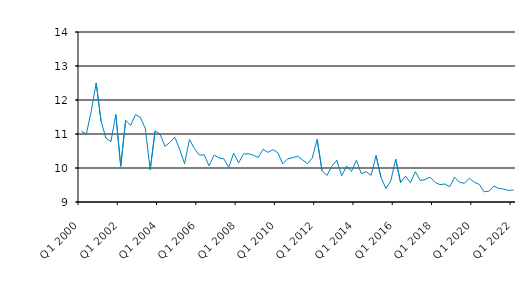
| Category | Series 0 |
|---|---|
| Q1 2000 | 11.08 |
| Q2 2000 | 11 |
| Q3 2000 | 11.679 |
| Q4 2000 | 12.5 |
| Q1 2001 | 11.375 |
| Q2 2001 | 10.875 |
| Q3 2001 | 10.775 |
| Q4 2001 | 11.57 |
| Q1 2002 | 10.05 |
| Q2 2002 | 11.405 |
| Q3 2002 | 11.25 |
| Q4 2002 | 11.566 |
| Q1 2003 | 11.492 |
| Q2 2003 | 11.162 |
| Q3 2003 | 9.95 |
| Q4 2003 | 11.091 |
| Q1 2004 | 11 |
| Q2 2004 | 10.638 |
| Q3 2004 | 10.75 |
| Q4 2004 | 10.908 |
| Q1 2005 | 10.55 |
| Q2 2005 | 10.125 |
| Q3 2005 | 10.843 |
| Q4 2005 | 10.573 |
| Q1 2006 | 10.38 |
| Q2 2006 | 10.387 |
| Q3 2006 | 10.06 |
| Q4 2006 | 10.38 |
| Q1 2007 | 10.3 |
| Q2 2007 | 10.27 |
| Q3 2007 | 10.017 |
| Q4 2007 | 10.44 |
| Q1 2008 | 10.15 |
| Q2 2008 | 10.41 |
| Q3 2008 | 10.42 |
| Q4 2008 | 10.38 |
| Q1 2009 | 10.31 |
| Q2 2009 | 10.55 |
| Q3 2009 | 10.46 |
| Q4 2009 | 10.54 |
| Q1 2010 | 10.45 |
| Q2 2010 | 10.12 |
| Q3 2010 | 10.27 |
| Q4 2010 | 10.3 |
| Q1 2011 | 10.35 |
| Q2 2011 | 10.24 |
| Q3 2011 | 10.125 |
| Q4 2011 | 10.29 |
| Q1 2012 | 10.84 |
| Q2 2012 | 9.92 |
| Q3 2012 | 9.78 |
| Q4 2012 | 10.05 |
| Q1 2013 | 10.23 |
| Q2 2013 | 9.77 |
| Q3 2013 | 10.06 |
| Q4 2013 | 9.9 |
| Q1 2014 | 10.23 |
| Q2 2014 | 9.83 |
| Q3 2014 | 9.89 |
| Q4 2014 | 9.78 |
| Q1 2015 | 10.37 |
| Q2 2015 | 9.726 |
| Q3 2015 | 9.4 |
| Q4 2015 | 9.62 |
| Q1 2016 | 10.26 |
| Q2 2016 | 9.57 |
| Q3 2016 | 9.76 |
| Q4 2016 | 9.57 |
| Q1 2017 | 9.89 |
| Q2 2017 | 9.63 |
| Q3 2017 | 9.66 |
| Q4 2017 | 9.73 |
| Q1 2018 | 9.58 |
| Q2 2018 | 9.51 |
| Q3 2018 | 9.53 |
| Q4 2018 | 9.45 |
| Q1 2019 | 9.73 |
| Q2 2019 | 9.58 |
| Q3 2019 | 9.55 |
| Q4 2019 | 9.7 |
| Q1 2020 | 9.58 |
| Q2 2020 | 9.52 |
| Q3 2020 | 9.3 |
| Q4 2020 | 9.32 |
| Q1 2021 | 9.464 |
| Q2 2021 | 9.4 |
| Q3 2021 | 9.38 |
| Q4 2021 | 9.34 |
| Q1 2022 | 9.354 |